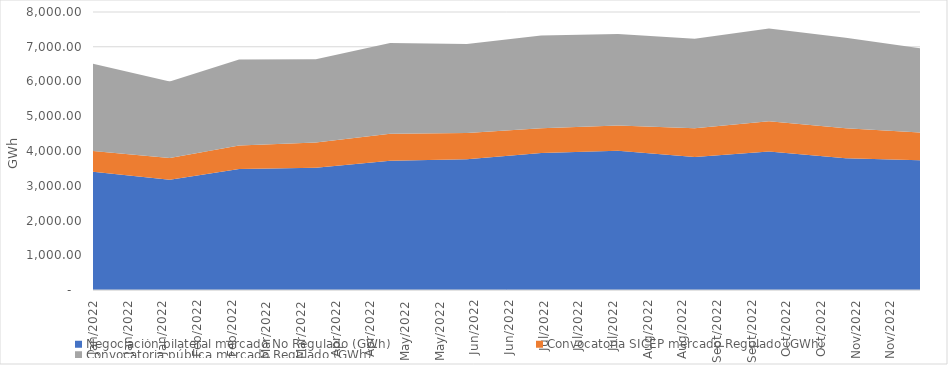
| Category | Negociación bilateral mercado No Regulado (GWh) | Convocatoria SICEP mercado Regulado (GWh) | Convocatoria pública mercado Regulado (GWh) |
|---|---|---|---|
| 2022-01-01 | 3402.071 | 599.448 | 2507.389 |
| 2022-02-01 | 3174.706 | 621.969 | 2205.567 |
| 2022-03-01 | 3481.7 | 675.172 | 2477.049 |
| 2022-04-01 | 3517.866 | 724.86 | 2395.016 |
| 2022-05-01 | 3718.836 | 774.064 | 2612.273 |
| 2022-06-01 | 3759.077 | 757.73 | 2561.283 |
| 2022-07-01 | 3939.605 | 718.18 | 2667.208 |
| 2022-08-01 | 4009.467 | 725.069 | 2632.954 |
| 2022-09-01 | 3827.458 | 823.81 | 2575.584 |
| 2022-10-01 | 3986.653 | 866.371 | 2669.189 |
| 2022-11-01 | 3792.394 | 863.067 | 2601.771 |
| 2022-12-01 | 3732.414 | 797.494 | 2425.305 |